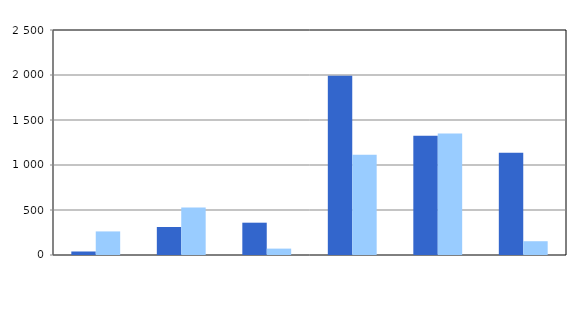
| Category | Series 0 | Series 1 |
|---|---|---|
| 0 | 39 | 262 |
| 1 | 311 | 529 |
| 2 | 359 | 71 |
| 3 | 1993 | 1115 |
| 4 | 1326 | 1351 |
| 5 | 1135 | 153 |